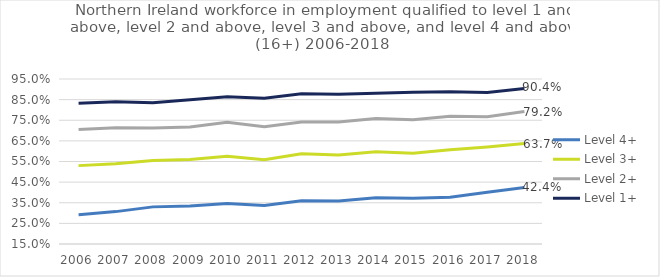
| Category | Level 4+ | Level 3+ | Level 2+ | Level 1+ |
|---|---|---|---|---|
| 2006 | 0.292 | 0.53 | 0.705 | 0.832 |
| 2007 | 0.307 | 0.539 | 0.714 | 0.84 |
| 2008 | 0.33 | 0.555 | 0.712 | 0.835 |
| 2009 | 0.334 | 0.56 | 0.717 | 0.849 |
| 2010 | 0.346 | 0.575 | 0.74 | 0.864 |
| 2011 | 0.337 | 0.559 | 0.718 | 0.857 |
| 2012 | 0.36 | 0.588 | 0.742 | 0.879 |
| 2013 | 0.358 | 0.581 | 0.741 | 0.876 |
| 2014 | 0.374 | 0.597 | 0.758 | 0.881 |
| 2015 | 0.372 | 0.59 | 0.753 | 0.886 |
| 2016 | 0.377 | 0.607 | 0.769 | 0.888 |
| 2017 | 0.401 | 0.62 | 0.767 | 0.885 |
| 2018 | 0.424 | 0.637 | 0.792 | 0.904 |